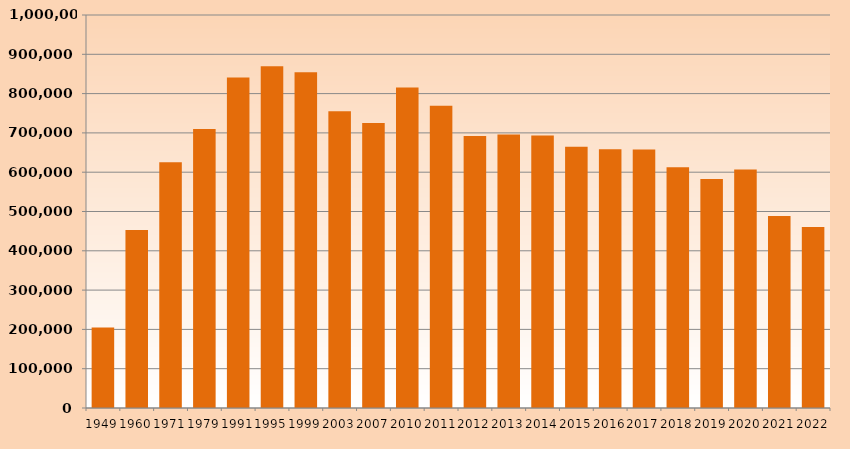
| Category | Series 1 |
|---|---|
| 1949.0 | 204682 |
| 1960.0 | 452802 |
| 1971.0 | 625242 |
| 1979.0 | 710047 |
| 1991.0 | 840700 |
| 1995.0 | 869900 |
| 1999.0 | 854200 |
| 2003.0 | 755400 |
| 2007.0 | 725393 |
| 2010.0 | 815570 |
| 2011.0 | 768800 |
| 2012.0 | 692200 |
| 2013.0 | 695800 |
| 2014.0 | 693500 |
| 2015.0 | 664900 |
| 2016.0 | 658600 |
| 2017.0 | 657600 |
| 2018.0 | 612400 |
| 2019.0 | 582500 |
| 2020.0 | 606600 |
| 2021.0 | 488800 |
| 2022.0 | 460500 |